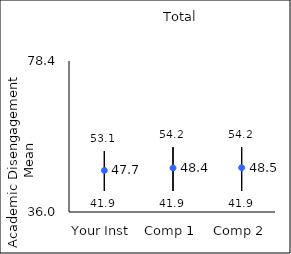
| Category | 25th percentile | 75th percentile | Mean |
|---|---|---|---|
| Your Inst | 41.9 | 53.1 | 47.68 |
| Comp 1 | 41.9 | 54.2 | 48.37 |
| Comp 2 | 41.9 | 54.2 | 48.45 |